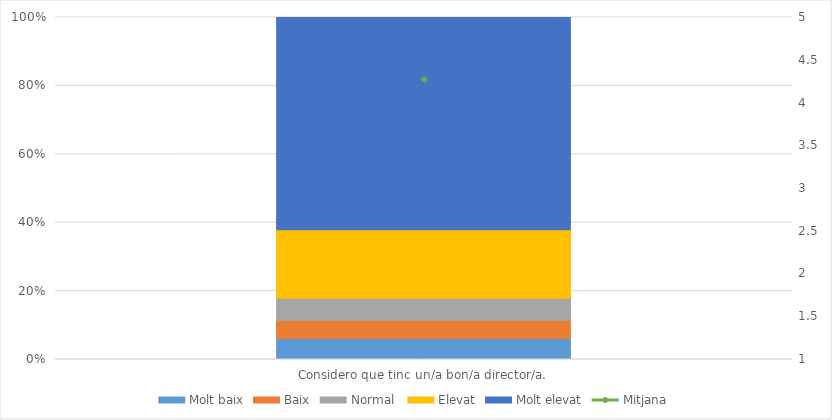
| Category | Molt baix | Baix | Normal  | Elevat | Molt elevat |
|---|---|---|---|---|---|
| Considero que tinc un/a bon/a director/a. | 20 | 17 | 21 | 65 | 201 |